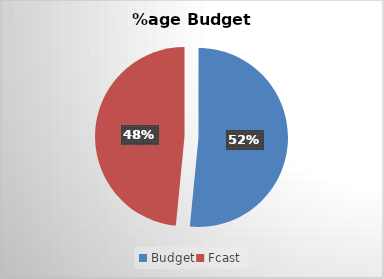
| Category | Series 0 |
|---|---|
| Budget | 1546.193 |
| Fcast | 1453.807 |